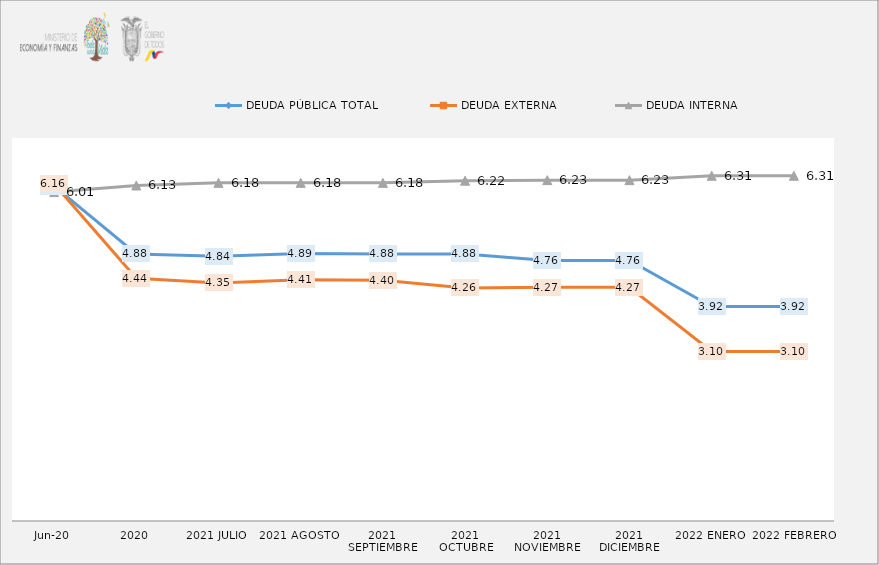
| Category | DEUDA PÚBLICA TOTAL | DEUDA EXTERNA  | DEUDA INTERNA |
|---|---|---|---|
| jun-20 | 6.121 | 6.161 | 6.012 |
| 2020 | 4.881 | 4.437 | 6.132 |
| 2021 JULIO | 4.84 | 4.351 | 6.18 |
| 2021 AGOSTO | 4.89 | 4.41 | 6.18 |
| 2021 SEPTIEMBRE | 4.88 | 4.4 | 6.18 |
| 2021 OCTUBRE | 4.88 | 4.26 | 6.22 |
| 2021 NOVIEMBRE | 4.76 | 4.27 | 6.23 |
| 2021 DICIEMBRE | 4.76 | 4.27 | 6.23 |
| 2022 ENERO | 3.92 | 3.1 | 6.31 |
| 2022 FEBRERO | 3.92 | 3.1 | 6.31 |